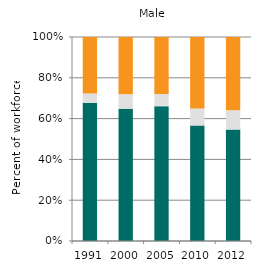
| Category | Agriculture | Industry | Services |
|---|---|---|---|
| 1991.0 | 67.817 | 4.499 | 27.685 |
| 2000.0 | 64.825 | 7.145 | 28.031 |
| 2005.0 | 66.069 | 5.99 | 27.941 |
| 2010.0 | 56.636 | 8.34 | 35.024 |
| 2012.0 | 54.606 | 9.464 | 35.93 |